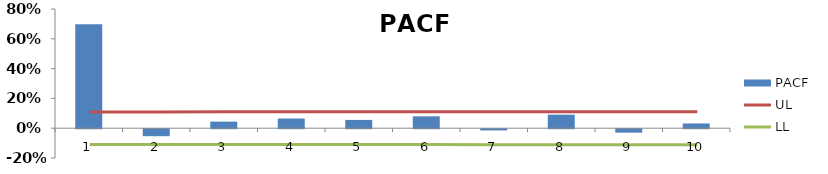
| Category | PACF |
|---|---|
| 0 | 0.697 |
| 1 | -0.047 |
| 2 | 0.044 |
| 3 | 0.065 |
| 4 | 0.056 |
| 5 | 0.08 |
| 6 | -0.008 |
| 7 | 0.091 |
| 8 | -0.023 |
| 9 | 0.032 |